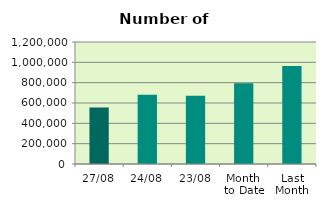
| Category | Series 0 |
|---|---|
| 27/08 | 555808 |
| 24/08 | 681768 |
| 23/08 | 670380 |
| Month 
to Date | 793157.895 |
| Last
Month | 964212.818 |